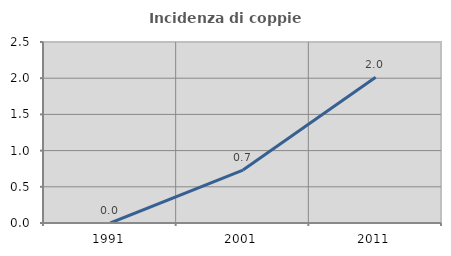
| Category | Incidenza di coppie miste |
|---|---|
| 1991.0 | 0 |
| 2001.0 | 0.731 |
| 2011.0 | 2.013 |